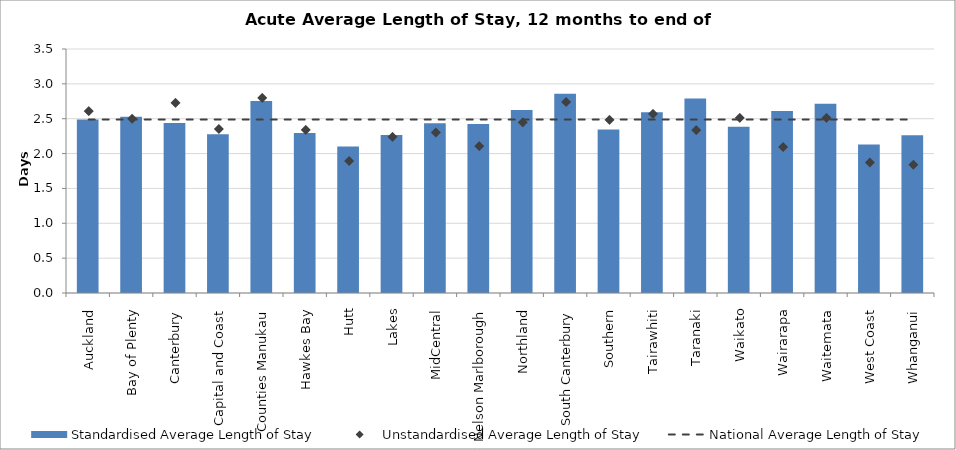
| Category | Standardised Average Length of Stay |
|---|---|
| Auckland | 2.488 |
| Bay of Plenty | 2.528 |
| Canterbury | 2.44 |
| Capital and Coast | 2.275 |
| Counties Manukau | 2.753 |
| Hawkes Bay | 2.293 |
| Hutt | 2.103 |
| Lakes | 2.266 |
| MidCentral | 2.434 |
| Nelson Marlborough | 2.426 |
| Northland | 2.624 |
| South Canterbury | 2.858 |
| Southern | 2.346 |
| Tairawhiti | 2.593 |
| Taranaki | 2.79 |
| Waikato | 2.384 |
| Wairarapa | 2.609 |
| Waitemata | 2.714 |
| West Coast | 2.13 |
| Whanganui | 2.264 |